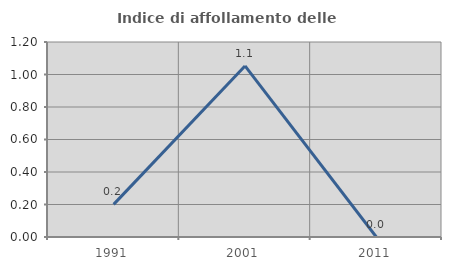
| Category | Indice di affollamento delle abitazioni  |
|---|---|
| 1991.0 | 0.201 |
| 2001.0 | 1.053 |
| 2011.0 | 0 |